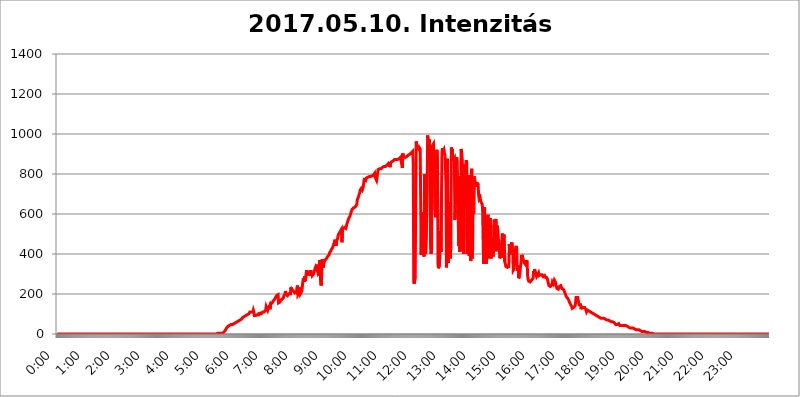
| Category | 2017.05.10. Intenzitás [W/m^2] |
|---|---|
| 0.0 | 0 |
| 0.0006944444444444445 | 0 |
| 0.001388888888888889 | 0 |
| 0.0020833333333333333 | 0 |
| 0.002777777777777778 | 0 |
| 0.003472222222222222 | 0 |
| 0.004166666666666667 | 0 |
| 0.004861111111111111 | 0 |
| 0.005555555555555556 | 0 |
| 0.0062499999999999995 | 0 |
| 0.006944444444444444 | 0 |
| 0.007638888888888889 | 0 |
| 0.008333333333333333 | 0 |
| 0.009027777777777779 | 0 |
| 0.009722222222222222 | 0 |
| 0.010416666666666666 | 0 |
| 0.011111111111111112 | 0 |
| 0.011805555555555555 | 0 |
| 0.012499999999999999 | 0 |
| 0.013194444444444444 | 0 |
| 0.013888888888888888 | 0 |
| 0.014583333333333332 | 0 |
| 0.015277777777777777 | 0 |
| 0.015972222222222224 | 0 |
| 0.016666666666666666 | 0 |
| 0.017361111111111112 | 0 |
| 0.018055555555555557 | 0 |
| 0.01875 | 0 |
| 0.019444444444444445 | 0 |
| 0.02013888888888889 | 0 |
| 0.020833333333333332 | 0 |
| 0.02152777777777778 | 0 |
| 0.022222222222222223 | 0 |
| 0.02291666666666667 | 0 |
| 0.02361111111111111 | 0 |
| 0.024305555555555556 | 0 |
| 0.024999999999999998 | 0 |
| 0.025694444444444447 | 0 |
| 0.02638888888888889 | 0 |
| 0.027083333333333334 | 0 |
| 0.027777777777777776 | 0 |
| 0.02847222222222222 | 0 |
| 0.029166666666666664 | 0 |
| 0.029861111111111113 | 0 |
| 0.030555555555555555 | 0 |
| 0.03125 | 0 |
| 0.03194444444444445 | 0 |
| 0.03263888888888889 | 0 |
| 0.03333333333333333 | 0 |
| 0.034027777777777775 | 0 |
| 0.034722222222222224 | 0 |
| 0.035416666666666666 | 0 |
| 0.036111111111111115 | 0 |
| 0.03680555555555556 | 0 |
| 0.0375 | 0 |
| 0.03819444444444444 | 0 |
| 0.03888888888888889 | 0 |
| 0.03958333333333333 | 0 |
| 0.04027777777777778 | 0 |
| 0.04097222222222222 | 0 |
| 0.041666666666666664 | 0 |
| 0.042361111111111106 | 0 |
| 0.04305555555555556 | 0 |
| 0.043750000000000004 | 0 |
| 0.044444444444444446 | 0 |
| 0.04513888888888889 | 0 |
| 0.04583333333333334 | 0 |
| 0.04652777777777778 | 0 |
| 0.04722222222222222 | 0 |
| 0.04791666666666666 | 0 |
| 0.04861111111111111 | 0 |
| 0.049305555555555554 | 0 |
| 0.049999999999999996 | 0 |
| 0.05069444444444445 | 0 |
| 0.051388888888888894 | 0 |
| 0.052083333333333336 | 0 |
| 0.05277777777777778 | 0 |
| 0.05347222222222222 | 0 |
| 0.05416666666666667 | 0 |
| 0.05486111111111111 | 0 |
| 0.05555555555555555 | 0 |
| 0.05625 | 0 |
| 0.05694444444444444 | 0 |
| 0.057638888888888885 | 0 |
| 0.05833333333333333 | 0 |
| 0.05902777777777778 | 0 |
| 0.059722222222222225 | 0 |
| 0.06041666666666667 | 0 |
| 0.061111111111111116 | 0 |
| 0.06180555555555556 | 0 |
| 0.0625 | 0 |
| 0.06319444444444444 | 0 |
| 0.06388888888888888 | 0 |
| 0.06458333333333334 | 0 |
| 0.06527777777777778 | 0 |
| 0.06597222222222222 | 0 |
| 0.06666666666666667 | 0 |
| 0.06736111111111111 | 0 |
| 0.06805555555555555 | 0 |
| 0.06874999999999999 | 0 |
| 0.06944444444444443 | 0 |
| 0.07013888888888889 | 0 |
| 0.07083333333333333 | 0 |
| 0.07152777777777779 | 0 |
| 0.07222222222222223 | 0 |
| 0.07291666666666667 | 0 |
| 0.07361111111111111 | 0 |
| 0.07430555555555556 | 0 |
| 0.075 | 0 |
| 0.07569444444444444 | 0 |
| 0.0763888888888889 | 0 |
| 0.07708333333333334 | 0 |
| 0.07777777777777778 | 0 |
| 0.07847222222222222 | 0 |
| 0.07916666666666666 | 0 |
| 0.0798611111111111 | 0 |
| 0.08055555555555556 | 0 |
| 0.08125 | 0 |
| 0.08194444444444444 | 0 |
| 0.08263888888888889 | 0 |
| 0.08333333333333333 | 0 |
| 0.08402777777777777 | 0 |
| 0.08472222222222221 | 0 |
| 0.08541666666666665 | 0 |
| 0.08611111111111112 | 0 |
| 0.08680555555555557 | 0 |
| 0.08750000000000001 | 0 |
| 0.08819444444444445 | 0 |
| 0.08888888888888889 | 0 |
| 0.08958333333333333 | 0 |
| 0.09027777777777778 | 0 |
| 0.09097222222222222 | 0 |
| 0.09166666666666667 | 0 |
| 0.09236111111111112 | 0 |
| 0.09305555555555556 | 0 |
| 0.09375 | 0 |
| 0.09444444444444444 | 0 |
| 0.09513888888888888 | 0 |
| 0.09583333333333333 | 0 |
| 0.09652777777777777 | 0 |
| 0.09722222222222222 | 0 |
| 0.09791666666666667 | 0 |
| 0.09861111111111111 | 0 |
| 0.09930555555555555 | 0 |
| 0.09999999999999999 | 0 |
| 0.10069444444444443 | 0 |
| 0.1013888888888889 | 0 |
| 0.10208333333333335 | 0 |
| 0.10277777777777779 | 0 |
| 0.10347222222222223 | 0 |
| 0.10416666666666667 | 0 |
| 0.10486111111111111 | 0 |
| 0.10555555555555556 | 0 |
| 0.10625 | 0 |
| 0.10694444444444444 | 0 |
| 0.1076388888888889 | 0 |
| 0.10833333333333334 | 0 |
| 0.10902777777777778 | 0 |
| 0.10972222222222222 | 0 |
| 0.1111111111111111 | 0 |
| 0.11180555555555556 | 0 |
| 0.11180555555555556 | 0 |
| 0.1125 | 0 |
| 0.11319444444444444 | 0 |
| 0.11388888888888889 | 0 |
| 0.11458333333333333 | 0 |
| 0.11527777777777777 | 0 |
| 0.11597222222222221 | 0 |
| 0.11666666666666665 | 0 |
| 0.1173611111111111 | 0 |
| 0.11805555555555557 | 0 |
| 0.11944444444444445 | 0 |
| 0.12013888888888889 | 0 |
| 0.12083333333333333 | 0 |
| 0.12152777777777778 | 0 |
| 0.12222222222222223 | 0 |
| 0.12291666666666667 | 0 |
| 0.12291666666666667 | 0 |
| 0.12361111111111112 | 0 |
| 0.12430555555555556 | 0 |
| 0.125 | 0 |
| 0.12569444444444444 | 0 |
| 0.12638888888888888 | 0 |
| 0.12708333333333333 | 0 |
| 0.16875 | 0 |
| 0.12847222222222224 | 0 |
| 0.12916666666666668 | 0 |
| 0.12986111111111112 | 0 |
| 0.13055555555555556 | 0 |
| 0.13125 | 0 |
| 0.13194444444444445 | 0 |
| 0.1326388888888889 | 0 |
| 0.13333333333333333 | 0 |
| 0.13402777777777777 | 0 |
| 0.13402777777777777 | 0 |
| 0.13472222222222222 | 0 |
| 0.13541666666666666 | 0 |
| 0.1361111111111111 | 0 |
| 0.13749999999999998 | 0 |
| 0.13819444444444443 | 0 |
| 0.1388888888888889 | 0 |
| 0.13958333333333334 | 0 |
| 0.14027777777777778 | 0 |
| 0.14097222222222222 | 0 |
| 0.14166666666666666 | 0 |
| 0.1423611111111111 | 0 |
| 0.14305555555555557 | 0 |
| 0.14375000000000002 | 0 |
| 0.14444444444444446 | 0 |
| 0.1451388888888889 | 0 |
| 0.1451388888888889 | 0 |
| 0.14652777777777778 | 0 |
| 0.14722222222222223 | 0 |
| 0.14791666666666667 | 0 |
| 0.1486111111111111 | 0 |
| 0.14930555555555555 | 0 |
| 0.15 | 0 |
| 0.15069444444444444 | 0 |
| 0.15138888888888888 | 0 |
| 0.15208333333333332 | 0 |
| 0.15277777777777776 | 0 |
| 0.15347222222222223 | 0 |
| 0.15416666666666667 | 0 |
| 0.15486111111111112 | 0 |
| 0.15555555555555556 | 0 |
| 0.15625 | 0 |
| 0.15694444444444444 | 0 |
| 0.15763888888888888 | 0 |
| 0.15833333333333333 | 0 |
| 0.15902777777777777 | 0 |
| 0.15972222222222224 | 0 |
| 0.16041666666666668 | 0 |
| 0.16111111111111112 | 0 |
| 0.16180555555555556 | 0 |
| 0.1625 | 0 |
| 0.16319444444444445 | 0 |
| 0.1638888888888889 | 0 |
| 0.16458333333333333 | 0 |
| 0.16527777777777777 | 0 |
| 0.16597222222222222 | 0 |
| 0.16666666666666666 | 0 |
| 0.1673611111111111 | 0 |
| 0.16805555555555554 | 0 |
| 0.16874999999999998 | 0 |
| 0.16944444444444443 | 0 |
| 0.17013888888888887 | 0 |
| 0.1708333333333333 | 0 |
| 0.17152777777777775 | 0 |
| 0.17222222222222225 | 0 |
| 0.1729166666666667 | 0 |
| 0.17361111111111113 | 0 |
| 0.17430555555555557 | 0 |
| 0.17500000000000002 | 0 |
| 0.17569444444444446 | 0 |
| 0.1763888888888889 | 0 |
| 0.17708333333333334 | 0 |
| 0.17777777777777778 | 0 |
| 0.17847222222222223 | 0 |
| 0.17916666666666667 | 0 |
| 0.1798611111111111 | 0 |
| 0.18055555555555555 | 0 |
| 0.18125 | 0 |
| 0.18194444444444444 | 0 |
| 0.1826388888888889 | 0 |
| 0.18333333333333335 | 0 |
| 0.1840277777777778 | 0 |
| 0.18472222222222223 | 0 |
| 0.18541666666666667 | 0 |
| 0.18611111111111112 | 0 |
| 0.18680555555555556 | 0 |
| 0.1875 | 0 |
| 0.18819444444444444 | 0 |
| 0.18888888888888888 | 0 |
| 0.18958333333333333 | 0 |
| 0.19027777777777777 | 0 |
| 0.1909722222222222 | 0 |
| 0.19166666666666665 | 0 |
| 0.19236111111111112 | 0 |
| 0.19305555555555554 | 0 |
| 0.19375 | 0 |
| 0.19444444444444445 | 0 |
| 0.1951388888888889 | 0 |
| 0.19583333333333333 | 0 |
| 0.19652777777777777 | 0 |
| 0.19722222222222222 | 0 |
| 0.19791666666666666 | 0 |
| 0.1986111111111111 | 0 |
| 0.19930555555555554 | 0 |
| 0.19999999999999998 | 0 |
| 0.20069444444444443 | 0 |
| 0.20138888888888887 | 0 |
| 0.2020833333333333 | 0 |
| 0.2027777777777778 | 0 |
| 0.2034722222222222 | 0 |
| 0.2041666666666667 | 0 |
| 0.20486111111111113 | 0 |
| 0.20555555555555557 | 0 |
| 0.20625000000000002 | 0 |
| 0.20694444444444446 | 0 |
| 0.2076388888888889 | 0 |
| 0.20833333333333334 | 0 |
| 0.20902777777777778 | 0 |
| 0.20972222222222223 | 0 |
| 0.21041666666666667 | 0 |
| 0.2111111111111111 | 0 |
| 0.21180555555555555 | 0 |
| 0.2125 | 0 |
| 0.21319444444444444 | 0 |
| 0.2138888888888889 | 0 |
| 0.21458333333333335 | 0 |
| 0.2152777777777778 | 0 |
| 0.21597222222222223 | 0 |
| 0.21666666666666667 | 0 |
| 0.21736111111111112 | 0 |
| 0.21805555555555556 | 0 |
| 0.21875 | 0 |
| 0.21944444444444444 | 0 |
| 0.22013888888888888 | 0 |
| 0.22083333333333333 | 0 |
| 0.22152777777777777 | 0 |
| 0.2222222222222222 | 0 |
| 0.22291666666666665 | 0 |
| 0.2236111111111111 | 0 |
| 0.22430555555555556 | 0 |
| 0.225 | 3.525 |
| 0.22569444444444445 | 3.525 |
| 0.2263888888888889 | 3.525 |
| 0.22708333333333333 | 3.525 |
| 0.22777777777777777 | 3.525 |
| 0.22847222222222222 | 3.525 |
| 0.22916666666666666 | 3.525 |
| 0.2298611111111111 | 3.525 |
| 0.23055555555555554 | 3.525 |
| 0.23124999999999998 | 3.525 |
| 0.23194444444444443 | 7.887 |
| 0.23263888888888887 | 7.887 |
| 0.2333333333333333 | 7.887 |
| 0.2340277777777778 | 12.257 |
| 0.2347222222222222 | 12.257 |
| 0.2354166666666667 | 16.636 |
| 0.23611111111111113 | 21.024 |
| 0.23680555555555557 | 21.024 |
| 0.23750000000000002 | 29.823 |
| 0.23819444444444446 | 29.823 |
| 0.2388888888888889 | 34.234 |
| 0.23958333333333334 | 38.653 |
| 0.24027777777777778 | 38.653 |
| 0.24097222222222223 | 38.653 |
| 0.24166666666666667 | 43.079 |
| 0.2423611111111111 | 43.079 |
| 0.24305555555555555 | 47.511 |
| 0.24375 | 47.511 |
| 0.24444444444444446 | 47.511 |
| 0.24513888888888888 | 47.511 |
| 0.24583333333333335 | 47.511 |
| 0.2465277777777778 | 51.951 |
| 0.24722222222222223 | 51.951 |
| 0.24791666666666667 | 51.951 |
| 0.24861111111111112 | 56.398 |
| 0.24930555555555556 | 56.398 |
| 0.25 | 56.398 |
| 0.25069444444444444 | 56.398 |
| 0.2513888888888889 | 60.85 |
| 0.2520833333333333 | 60.85 |
| 0.25277777777777777 | 60.85 |
| 0.2534722222222222 | 65.31 |
| 0.25416666666666665 | 65.31 |
| 0.2548611111111111 | 65.31 |
| 0.2555555555555556 | 65.31 |
| 0.25625000000000003 | 69.775 |
| 0.2569444444444445 | 69.775 |
| 0.2576388888888889 | 74.246 |
| 0.25833333333333336 | 74.246 |
| 0.2590277777777778 | 78.722 |
| 0.25972222222222224 | 78.722 |
| 0.2604166666666667 | 83.205 |
| 0.2611111111111111 | 83.205 |
| 0.26180555555555557 | 87.692 |
| 0.2625 | 87.692 |
| 0.26319444444444445 | 92.184 |
| 0.2638888888888889 | 92.184 |
| 0.26458333333333334 | 92.184 |
| 0.2652777777777778 | 92.184 |
| 0.2659722222222222 | 92.184 |
| 0.26666666666666666 | 96.682 |
| 0.2673611111111111 | 96.682 |
| 0.26805555555555555 | 101.184 |
| 0.26875 | 101.184 |
| 0.26944444444444443 | 105.69 |
| 0.2701388888888889 | 110.201 |
| 0.2708333333333333 | 105.69 |
| 0.27152777777777776 | 110.201 |
| 0.2722222222222222 | 110.201 |
| 0.27291666666666664 | 110.201 |
| 0.2736111111111111 | 110.201 |
| 0.2743055555555555 | 110.201 |
| 0.27499999999999997 | 119.235 |
| 0.27569444444444446 | 110.201 |
| 0.27638888888888885 | 92.184 |
| 0.27708333333333335 | 87.692 |
| 0.2777777777777778 | 92.184 |
| 0.27847222222222223 | 92.184 |
| 0.2791666666666667 | 92.184 |
| 0.2798611111111111 | 96.682 |
| 0.28055555555555556 | 96.682 |
| 0.28125 | 96.682 |
| 0.28194444444444444 | 96.682 |
| 0.2826388888888889 | 96.682 |
| 0.2833333333333333 | 110.201 |
| 0.28402777777777777 | 101.184 |
| 0.2847222222222222 | 96.682 |
| 0.28541666666666665 | 96.682 |
| 0.28611111111111115 | 101.184 |
| 0.28680555555555554 | 101.184 |
| 0.28750000000000003 | 101.184 |
| 0.2881944444444445 | 110.201 |
| 0.2888888888888889 | 105.69 |
| 0.28958333333333336 | 110.201 |
| 0.2902777777777778 | 110.201 |
| 0.29097222222222224 | 114.716 |
| 0.2916666666666667 | 105.69 |
| 0.2923611111111111 | 119.235 |
| 0.29305555555555557 | 137.347 |
| 0.29375 | 137.347 |
| 0.29444444444444445 | 141.884 |
| 0.2951388888888889 | 119.235 |
| 0.29583333333333334 | 128.284 |
| 0.2965277777777778 | 132.814 |
| 0.2972222222222222 | 128.284 |
| 0.29791666666666666 | 141.884 |
| 0.2986111111111111 | 123.758 |
| 0.29930555555555555 | 155.509 |
| 0.3 | 155.509 |
| 0.30069444444444443 | 155.509 |
| 0.3013888888888889 | 155.509 |
| 0.3020833333333333 | 160.056 |
| 0.30277777777777776 | 164.605 |
| 0.3034722222222222 | 164.605 |
| 0.30416666666666664 | 169.156 |
| 0.3048611111111111 | 173.709 |
| 0.3055555555555555 | 178.264 |
| 0.30624999999999997 | 182.82 |
| 0.3069444444444444 | 187.378 |
| 0.3076388888888889 | 191.937 |
| 0.30833333333333335 | 196.497 |
| 0.3090277777777778 | 196.497 |
| 0.30972222222222223 | 196.497 |
| 0.3104166666666667 | 155.509 |
| 0.3111111111111111 | 155.509 |
| 0.31180555555555556 | 155.509 |
| 0.3125 | 160.056 |
| 0.31319444444444444 | 169.156 |
| 0.3138888888888889 | 164.605 |
| 0.3145833333333333 | 169.156 |
| 0.31527777777777777 | 173.709 |
| 0.3159722222222222 | 173.709 |
| 0.31666666666666665 | 178.264 |
| 0.31736111111111115 | 182.82 |
| 0.31805555555555554 | 191.937 |
| 0.31875000000000003 | 187.378 |
| 0.3194444444444445 | 201.058 |
| 0.3201388888888889 | 214.746 |
| 0.32083333333333336 | 201.058 |
| 0.3215277777777778 | 196.497 |
| 0.32222222222222224 | 196.497 |
| 0.3229166666666667 | 191.937 |
| 0.3236111111111111 | 191.937 |
| 0.32430555555555557 | 191.937 |
| 0.325 | 201.058 |
| 0.32569444444444445 | 196.497 |
| 0.3263888888888889 | 196.497 |
| 0.32708333333333334 | 201.058 |
| 0.3277777777777778 | 233 |
| 0.3284722222222222 | 210.182 |
| 0.32916666666666666 | 223.873 |
| 0.3298611111111111 | 223.873 |
| 0.33055555555555555 | 219.309 |
| 0.33125 | 214.746 |
| 0.33194444444444443 | 210.182 |
| 0.3326388888888889 | 214.746 |
| 0.3333333333333333 | 205.62 |
| 0.3340277777777778 | 210.182 |
| 0.3347222222222222 | 201.058 |
| 0.3354166666666667 | 210.182 |
| 0.3361111111111111 | 228.436 |
| 0.3368055555555556 | 242.127 |
| 0.33749999999999997 | 196.497 |
| 0.33819444444444446 | 201.058 |
| 0.33888888888888885 | 205.62 |
| 0.33958333333333335 | 205.62 |
| 0.34027777777777773 | 233 |
| 0.34097222222222223 | 201.058 |
| 0.3416666666666666 | 205.62 |
| 0.3423611111111111 | 201.058 |
| 0.3430555555555555 | 214.746 |
| 0.34375 | 237.564 |
| 0.3444444444444445 | 260.373 |
| 0.3451388888888889 | 278.603 |
| 0.3458333333333334 | 269.49 |
| 0.34652777777777777 | 260.373 |
| 0.34722222222222227 | 287.709 |
| 0.34791666666666665 | 264.932 |
| 0.34861111111111115 | 287.709 |
| 0.34930555555555554 | 305.898 |
| 0.35000000000000003 | 319.517 |
| 0.3506944444444444 | 301.354 |
| 0.3513888888888889 | 292.259 |
| 0.3520833333333333 | 296.808 |
| 0.3527777777777778 | 314.98 |
| 0.3534722222222222 | 292.259 |
| 0.3541666666666667 | 296.808 |
| 0.3548611111111111 | 305.898 |
| 0.35555555555555557 | 319.517 |
| 0.35625 | 296.808 |
| 0.35694444444444445 | 305.898 |
| 0.3576388888888889 | 292.259 |
| 0.35833333333333334 | 292.259 |
| 0.3590277777777778 | 292.259 |
| 0.3597222222222222 | 301.354 |
| 0.36041666666666666 | 314.98 |
| 0.3611111111111111 | 319.517 |
| 0.36180555555555555 | 328.584 |
| 0.3625 | 314.98 |
| 0.36319444444444443 | 310.44 |
| 0.3638888888888889 | 346.682 |
| 0.3645833333333333 | 319.517 |
| 0.3652777777777778 | 310.44 |
| 0.3659722222222222 | 314.98 |
| 0.3666666666666667 | 328.584 |
| 0.3673611111111111 | 292.259 |
| 0.3680555555555556 | 369.23 |
| 0.36874999999999997 | 346.682 |
| 0.36944444444444446 | 260.373 |
| 0.37013888888888885 | 242.127 |
| 0.37083333333333335 | 296.808 |
| 0.37152777777777773 | 373.729 |
| 0.37222222222222223 | 373.729 |
| 0.3729166666666666 | 333.113 |
| 0.3736111111111111 | 342.162 |
| 0.3743055555555555 | 360.221 |
| 0.375 | 360.221 |
| 0.3756944444444445 | 369.23 |
| 0.3763888888888889 | 369.23 |
| 0.3770833333333334 | 373.729 |
| 0.37777777777777777 | 378.224 |
| 0.37847222222222227 | 378.224 |
| 0.37916666666666665 | 387.202 |
| 0.37986111111111115 | 387.202 |
| 0.38055555555555554 | 391.685 |
| 0.38125000000000003 | 396.164 |
| 0.3819444444444444 | 405.108 |
| 0.3826388888888889 | 405.108 |
| 0.3833333333333333 | 414.035 |
| 0.3840277777777778 | 418.492 |
| 0.3847222222222222 | 422.943 |
| 0.3854166666666667 | 427.39 |
| 0.3861111111111111 | 431.833 |
| 0.38680555555555557 | 436.27 |
| 0.3875 | 445.129 |
| 0.38819444444444445 | 449.551 |
| 0.3888888888888889 | 462.786 |
| 0.38958333333333334 | 471.582 |
| 0.3902777777777778 | 467.187 |
| 0.3909722222222222 | 440.702 |
| 0.39166666666666666 | 462.786 |
| 0.3923611111111111 | 467.187 |
| 0.39305555555555555 | 475.972 |
| 0.39375 | 489.108 |
| 0.39444444444444443 | 497.836 |
| 0.3951388888888889 | 502.192 |
| 0.3958333333333333 | 506.542 |
| 0.3965277777777778 | 510.885 |
| 0.3972222222222222 | 515.223 |
| 0.3979166666666667 | 519.555 |
| 0.3986111111111111 | 523.88 |
| 0.3993055555555556 | 458.38 |
| 0.39999999999999997 | 515.223 |
| 0.40069444444444446 | 523.88 |
| 0.40138888888888885 | 523.88 |
| 0.40208333333333335 | 528.2 |
| 0.40277777777777773 | 532.513 |
| 0.40347222222222223 | 528.2 |
| 0.4041666666666666 | 532.513 |
| 0.4048611111111111 | 528.2 |
| 0.4055555555555555 | 541.121 |
| 0.40625 | 549.704 |
| 0.4069444444444445 | 558.261 |
| 0.4076388888888889 | 566.793 |
| 0.4083333333333334 | 571.049 |
| 0.40902777777777777 | 579.542 |
| 0.40972222222222227 | 583.779 |
| 0.41041666666666665 | 588.009 |
| 0.41111111111111115 | 596.45 |
| 0.41180555555555554 | 604.864 |
| 0.41250000000000003 | 613.252 |
| 0.4131944444444444 | 621.613 |
| 0.4138888888888889 | 625.784 |
| 0.4145833333333333 | 625.784 |
| 0.4152777777777778 | 629.948 |
| 0.4159722222222222 | 629.948 |
| 0.4166666666666667 | 625.784 |
| 0.4173611111111111 | 634.105 |
| 0.41805555555555557 | 634.105 |
| 0.41875 | 638.256 |
| 0.41944444444444445 | 642.4 |
| 0.4201388888888889 | 650.667 |
| 0.42083333333333334 | 671.22 |
| 0.4215277777777778 | 675.311 |
| 0.4222222222222222 | 683.473 |
| 0.42291666666666666 | 691.608 |
| 0.4236111111111111 | 699.717 |
| 0.42430555555555555 | 707.8 |
| 0.425 | 719.877 |
| 0.42569444444444443 | 719.877 |
| 0.4263888888888889 | 727.896 |
| 0.4270833333333333 | 727.896 |
| 0.4277777777777778 | 719.877 |
| 0.4284722222222222 | 727.896 |
| 0.4291666666666667 | 735.89 |
| 0.4298611111111111 | 755.766 |
| 0.4305555555555556 | 771.559 |
| 0.43124999999999997 | 771.559 |
| 0.43194444444444446 | 771.559 |
| 0.43263888888888885 | 767.62 |
| 0.43333333333333335 | 779.42 |
| 0.43402777777777773 | 779.42 |
| 0.43472222222222223 | 783.342 |
| 0.4354166666666666 | 783.342 |
| 0.4361111111111111 | 783.342 |
| 0.4368055555555555 | 783.342 |
| 0.4375 | 787.258 |
| 0.4381944444444445 | 783.342 |
| 0.4388888888888889 | 787.258 |
| 0.4395833333333334 | 787.258 |
| 0.44027777777777777 | 787.258 |
| 0.44097222222222227 | 787.258 |
| 0.44166666666666665 | 791.169 |
| 0.44236111111111115 | 791.169 |
| 0.44305555555555554 | 791.169 |
| 0.44375000000000003 | 795.074 |
| 0.4444444444444444 | 798.974 |
| 0.4451388888888889 | 802.868 |
| 0.4458333333333333 | 783.342 |
| 0.4465277777777778 | 783.342 |
| 0.4472222222222222 | 779.42 |
| 0.4479166666666667 | 767.62 |
| 0.4486111111111111 | 783.342 |
| 0.44930555555555557 | 787.258 |
| 0.45 | 822.26 |
| 0.45069444444444445 | 826.123 |
| 0.4513888888888889 | 826.123 |
| 0.45208333333333334 | 826.123 |
| 0.4527777777777778 | 826.123 |
| 0.4534722222222222 | 826.123 |
| 0.45416666666666666 | 826.123 |
| 0.4548611111111111 | 826.123 |
| 0.45555555555555555 | 829.981 |
| 0.45625 | 833.834 |
| 0.45694444444444443 | 833.834 |
| 0.4576388888888889 | 837.682 |
| 0.4583333333333333 | 837.682 |
| 0.4590277777777778 | 841.526 |
| 0.4597222222222222 | 841.526 |
| 0.4604166666666667 | 837.682 |
| 0.4611111111111111 | 841.526 |
| 0.4618055555555556 | 841.526 |
| 0.46249999999999997 | 845.365 |
| 0.46319444444444446 | 849.199 |
| 0.46388888888888885 | 849.199 |
| 0.46458333333333335 | 853.029 |
| 0.46527777777777773 | 853.029 |
| 0.46597222222222223 | 845.365 |
| 0.4666666666666666 | 833.834 |
| 0.4673611111111111 | 853.029 |
| 0.4680555555555555 | 849.199 |
| 0.46875 | 860.676 |
| 0.4694444444444445 | 864.493 |
| 0.4701388888888889 | 860.676 |
| 0.4708333333333334 | 864.493 |
| 0.47152777777777777 | 868.305 |
| 0.47222222222222227 | 868.305 |
| 0.47291666666666665 | 872.114 |
| 0.47361111111111115 | 875.918 |
| 0.47430555555555554 | 875.918 |
| 0.47500000000000003 | 872.114 |
| 0.4756944444444444 | 868.305 |
| 0.4763888888888889 | 868.305 |
| 0.4770833333333333 | 872.114 |
| 0.4777777777777778 | 868.305 |
| 0.4784722222222222 | 872.114 |
| 0.4791666666666667 | 875.918 |
| 0.4798611111111111 | 875.918 |
| 0.48055555555555557 | 879.719 |
| 0.48125 | 883.516 |
| 0.48194444444444445 | 887.309 |
| 0.4826388888888889 | 887.309 |
| 0.48333333333333334 | 845.365 |
| 0.4840277777777778 | 829.981 |
| 0.4847222222222222 | 902.447 |
| 0.48541666666666666 | 879.719 |
| 0.4861111111111111 | 887.309 |
| 0.48680555555555555 | 887.309 |
| 0.4875 | 883.516 |
| 0.48819444444444443 | 883.516 |
| 0.4888888888888889 | 883.516 |
| 0.4895833333333333 | 887.309 |
| 0.4902777777777778 | 887.309 |
| 0.4909722222222222 | 887.309 |
| 0.4916666666666667 | 891.099 |
| 0.4923611111111111 | 894.885 |
| 0.4930555555555556 | 894.885 |
| 0.49374999999999997 | 898.668 |
| 0.49444444444444446 | 898.668 |
| 0.49513888888888885 | 898.668 |
| 0.49583333333333335 | 902.447 |
| 0.49652777777777773 | 906.223 |
| 0.49722222222222223 | 909.996 |
| 0.4979166666666666 | 909.996 |
| 0.4986111111111111 | 913.766 |
| 0.4993055555555555 | 853.029 |
| 0.5 | 260.373 |
| 0.5006944444444444 | 251.251 |
| 0.5013888888888889 | 255.813 |
| 0.5020833333333333 | 287.709 |
| 0.5027777777777778 | 687.544 |
| 0.5034722222222222 | 962.555 |
| 0.5041666666666667 | 943.832 |
| 0.5048611111111111 | 940.082 |
| 0.5055555555555555 | 932.576 |
| 0.50625 | 928.819 |
| 0.5069444444444444 | 925.06 |
| 0.5076388888888889 | 932.576 |
| 0.5083333333333333 | 932.576 |
| 0.5090277777777777 | 925.06 |
| 0.5097222222222222 | 671.22 |
| 0.5104166666666666 | 396.164 |
| 0.5111111111111112 | 609.062 |
| 0.5118055555555555 | 418.492 |
| 0.5125000000000001 | 480.356 |
| 0.5131944444444444 | 562.53 |
| 0.513888888888889 | 396.164 |
| 0.5145833333333333 | 387.202 |
| 0.5152777777777778 | 798.974 |
| 0.5159722222222222 | 414.035 |
| 0.5166666666666667 | 400.638 |
| 0.517361111111111 | 400.638 |
| 0.5180555555555556 | 566.793 |
| 0.5187499999999999 | 687.544 |
| 0.5194444444444445 | 992.448 |
| 0.5201388888888888 | 966.295 |
| 0.5208333333333334 | 928.819 |
| 0.5215277777777778 | 973.772 |
| 0.5222222222222223 | 970.034 |
| 0.5229166666666667 | 837.682 |
| 0.5236111111111111 | 431.833 |
| 0.5243055555555556 | 400.638 |
| 0.525 | 431.833 |
| 0.5256944444444445 | 883.516 |
| 0.5263888888888889 | 943.832 |
| 0.5270833333333333 | 947.58 |
| 0.5277777777777778 | 951.327 |
| 0.5284722222222222 | 747.834 |
| 0.5291666666666667 | 868.305 |
| 0.5298611111111111 | 621.613 |
| 0.5305555555555556 | 583.779 |
| 0.53125 | 731.896 |
| 0.5319444444444444 | 906.223 |
| 0.5326388888888889 | 921.298 |
| 0.5333333333333333 | 853.029 |
| 0.5340277777777778 | 351.198 |
| 0.5347222222222222 | 328.584 |
| 0.5354166666666667 | 324.052 |
| 0.5361111111111111 | 346.682 |
| 0.5368055555555555 | 449.551 |
| 0.5375 | 515.223 |
| 0.5381944444444444 | 409.574 |
| 0.5388888888888889 | 683.473 |
| 0.5395833333333333 | 906.223 |
| 0.5402777777777777 | 928.819 |
| 0.5409722222222222 | 909.996 |
| 0.5416666666666666 | 909.996 |
| 0.5423611111111112 | 921.298 |
| 0.5430555555555555 | 906.223 |
| 0.5437500000000001 | 894.885 |
| 0.5444444444444444 | 841.526 |
| 0.545138888888889 | 747.834 |
| 0.5458333333333333 | 333.113 |
| 0.5465277777777778 | 405.108 |
| 0.5472222222222222 | 875.918 |
| 0.5479166666666667 | 515.223 |
| 0.548611111111111 | 355.712 |
| 0.5493055555555556 | 562.53 |
| 0.5499999999999999 | 658.909 |
| 0.5506944444444445 | 480.356 |
| 0.5513888888888888 | 378.224 |
| 0.5520833333333334 | 462.786 |
| 0.5527777777777778 | 932.576 |
| 0.5534722222222223 | 917.534 |
| 0.5541666666666667 | 925.06 |
| 0.5548611111111111 | 864.493 |
| 0.5555555555555556 | 872.114 |
| 0.55625 | 868.305 |
| 0.5569444444444445 | 879.719 |
| 0.5576388888888889 | 571.049 |
| 0.5583333333333333 | 617.436 |
| 0.5590277777777778 | 617.436 |
| 0.5597222222222222 | 875.918 |
| 0.5604166666666667 | 883.516 |
| 0.5611111111111111 | 779.42 |
| 0.5618055555555556 | 783.342 |
| 0.5625 | 775.492 |
| 0.5631944444444444 | 440.702 |
| 0.5638888888888889 | 787.258 |
| 0.5645833333333333 | 409.574 |
| 0.5652777777777778 | 549.704 |
| 0.5659722222222222 | 418.492 |
| 0.5666666666666667 | 925.06 |
| 0.5673611111111111 | 894.885 |
| 0.5680555555555555 | 872.114 |
| 0.56875 | 562.53 |
| 0.5694444444444444 | 418.492 |
| 0.5701388888888889 | 400.638 |
| 0.5708333333333333 | 583.779 |
| 0.5715277777777777 | 849.199 |
| 0.5722222222222222 | 814.519 |
| 0.5729166666666666 | 634.105 |
| 0.5736111111111112 | 868.305 |
| 0.5743055555555555 | 860.676 |
| 0.5750000000000001 | 400.638 |
| 0.5756944444444444 | 400.638 |
| 0.576388888888889 | 571.049 |
| 0.5770833333333333 | 795.074 |
| 0.5777777777777778 | 391.685 |
| 0.5784722222222222 | 422.943 |
| 0.5791666666666667 | 795.074 |
| 0.579861111111111 | 364.728 |
| 0.5805555555555556 | 414.035 |
| 0.5812499999999999 | 826.123 |
| 0.5819444444444445 | 378.224 |
| 0.5826388888888888 | 427.39 |
| 0.5833333333333334 | 763.674 |
| 0.5840277777777778 | 600.661 |
| 0.5847222222222223 | 787.258 |
| 0.5854166666666667 | 779.42 |
| 0.5861111111111111 | 759.723 |
| 0.5868055555555556 | 759.723 |
| 0.5875 | 735.89 |
| 0.5881944444444445 | 759.723 |
| 0.5888888888888889 | 747.834 |
| 0.5895833333333333 | 755.766 |
| 0.5902777777777778 | 743.859 |
| 0.5909722222222222 | 695.666 |
| 0.5916666666666667 | 675.311 |
| 0.5923611111111111 | 675.311 |
| 0.5930555555555556 | 683.473 |
| 0.59375 | 667.123 |
| 0.5944444444444444 | 658.909 |
| 0.5951388888888889 | 654.791 |
| 0.5958333333333333 | 650.667 |
| 0.5965277777777778 | 629.948 |
| 0.5972222222222222 | 625.784 |
| 0.5979166666666667 | 351.198 |
| 0.5986111111111111 | 369.23 |
| 0.5993055555555555 | 634.105 |
| 0.6 | 351.198 |
| 0.6006944444444444 | 373.729 |
| 0.6013888888888889 | 351.198 |
| 0.6020833333333333 | 355.712 |
| 0.6027777777777777 | 387.202 |
| 0.6034722222222222 | 583.779 |
| 0.6041666666666666 | 596.45 |
| 0.6048611111111112 | 475.972 |
| 0.6055555555555555 | 391.685 |
| 0.6062500000000001 | 396.164 |
| 0.6069444444444444 | 378.224 |
| 0.607638888888889 | 579.542 |
| 0.6083333333333333 | 378.224 |
| 0.6090277777777778 | 373.729 |
| 0.6097222222222222 | 471.582 |
| 0.6104166666666667 | 471.582 |
| 0.611111111111111 | 387.202 |
| 0.6118055555555556 | 440.702 |
| 0.6124999999999999 | 566.793 |
| 0.6131944444444445 | 566.793 |
| 0.6138888888888888 | 562.53 |
| 0.6145833333333334 | 566.793 |
| 0.6152777777777778 | 575.299 |
| 0.6159722222222223 | 414.035 |
| 0.6166666666666667 | 541.121 |
| 0.6173611111111111 | 532.513 |
| 0.6180555555555556 | 515.223 |
| 0.61875 | 471.582 |
| 0.6194444444444445 | 422.943 |
| 0.6201388888888889 | 414.035 |
| 0.6208333333333333 | 378.224 |
| 0.6215277777777778 | 378.224 |
| 0.6222222222222222 | 405.108 |
| 0.6229166666666667 | 436.27 |
| 0.6236111111111111 | 471.582 |
| 0.6243055555555556 | 502.192 |
| 0.625 | 506.542 |
| 0.6256944444444444 | 382.715 |
| 0.6263888888888889 | 497.836 |
| 0.6270833333333333 | 502.192 |
| 0.6277777777777778 | 360.221 |
| 0.6284722222222222 | 351.198 |
| 0.6291666666666667 | 337.639 |
| 0.6298611111111111 | 333.113 |
| 0.6305555555555555 | 333.113 |
| 0.63125 | 333.113 |
| 0.6319444444444444 | 328.584 |
| 0.6326388888888889 | 328.584 |
| 0.6333333333333333 | 337.639 |
| 0.6340277777777777 | 449.551 |
| 0.6347222222222222 | 396.164 |
| 0.6354166666666666 | 427.39 |
| 0.6361111111111112 | 431.833 |
| 0.6368055555555555 | 449.551 |
| 0.6375000000000001 | 458.38 |
| 0.6381944444444444 | 436.27 |
| 0.638888888888889 | 418.492 |
| 0.6395833333333333 | 319.517 |
| 0.6402777777777778 | 314.98 |
| 0.6409722222222222 | 328.584 |
| 0.6416666666666667 | 396.164 |
| 0.642361111111111 | 391.685 |
| 0.6430555555555556 | 431.833 |
| 0.6437499999999999 | 440.702 |
| 0.6444444444444445 | 422.943 |
| 0.6451388888888888 | 314.98 |
| 0.6458333333333334 | 310.44 |
| 0.6465277777777778 | 342.162 |
| 0.6472222222222223 | 278.603 |
| 0.6479166666666667 | 287.709 |
| 0.6486111111111111 | 301.354 |
| 0.6493055555555556 | 301.354 |
| 0.65 | 305.898 |
| 0.6506944444444445 | 364.728 |
| 0.6513888888888889 | 396.164 |
| 0.6520833333333333 | 396.164 |
| 0.6527777777777778 | 382.715 |
| 0.6534722222222222 | 382.715 |
| 0.6541666666666667 | 387.202 |
| 0.6548611111111111 | 355.712 |
| 0.6555555555555556 | 360.221 |
| 0.65625 | 355.712 |
| 0.6569444444444444 | 346.682 |
| 0.6576388888888889 | 355.712 |
| 0.6583333333333333 | 369.23 |
| 0.6590277777777778 | 360.221 |
| 0.6597222222222222 | 292.259 |
| 0.6604166666666667 | 274.047 |
| 0.6611111111111111 | 264.932 |
| 0.6618055555555555 | 260.373 |
| 0.6625 | 260.373 |
| 0.6631944444444444 | 260.373 |
| 0.6638888888888889 | 260.373 |
| 0.6645833333333333 | 264.932 |
| 0.6652777777777777 | 269.49 |
| 0.6659722222222222 | 269.49 |
| 0.6666666666666666 | 274.047 |
| 0.6673611111111111 | 278.603 |
| 0.6680555555555556 | 314.98 |
| 0.6687500000000001 | 296.808 |
| 0.6694444444444444 | 324.052 |
| 0.6701388888888888 | 314.98 |
| 0.6708333333333334 | 305.898 |
| 0.6715277777777778 | 305.898 |
| 0.6722222222222222 | 287.709 |
| 0.6729166666666666 | 292.259 |
| 0.6736111111111112 | 296.808 |
| 0.6743055555555556 | 296.808 |
| 0.6749999999999999 | 305.898 |
| 0.6756944444444444 | 292.259 |
| 0.6763888888888889 | 292.259 |
| 0.6770833333333334 | 296.808 |
| 0.6777777777777777 | 296.808 |
| 0.6784722222222223 | 301.354 |
| 0.6791666666666667 | 292.259 |
| 0.6798611111111111 | 296.808 |
| 0.6805555555555555 | 296.808 |
| 0.68125 | 287.709 |
| 0.6819444444444445 | 292.259 |
| 0.6826388888888889 | 292.259 |
| 0.6833333333333332 | 292.259 |
| 0.6840277777777778 | 283.156 |
| 0.6847222222222222 | 283.156 |
| 0.6854166666666667 | 278.603 |
| 0.686111111111111 | 283.156 |
| 0.6868055555555556 | 278.603 |
| 0.6875 | 274.047 |
| 0.6881944444444444 | 269.49 |
| 0.688888888888889 | 251.251 |
| 0.6895833333333333 | 242.127 |
| 0.6902777777777778 | 237.564 |
| 0.6909722222222222 | 237.564 |
| 0.6916666666666668 | 237.564 |
| 0.6923611111111111 | 242.127 |
| 0.6930555555555555 | 237.564 |
| 0.69375 | 246.689 |
| 0.6944444444444445 | 260.373 |
| 0.6951388888888889 | 255.813 |
| 0.6958333333333333 | 251.251 |
| 0.6965277777777777 | 260.373 |
| 0.6972222222222223 | 269.49 |
| 0.6979166666666666 | 264.932 |
| 0.6986111111111111 | 260.373 |
| 0.6993055555555556 | 246.689 |
| 0.7000000000000001 | 242.127 |
| 0.7006944444444444 | 228.436 |
| 0.7013888888888888 | 223.873 |
| 0.7020833333333334 | 223.873 |
| 0.7027777777777778 | 223.873 |
| 0.7034722222222222 | 228.436 |
| 0.7041666666666666 | 237.564 |
| 0.7048611111111112 | 237.564 |
| 0.7055555555555556 | 242.127 |
| 0.7062499999999999 | 242.127 |
| 0.7069444444444444 | 237.564 |
| 0.7076388888888889 | 228.436 |
| 0.7083333333333334 | 223.873 |
| 0.7090277777777777 | 223.873 |
| 0.7097222222222223 | 223.873 |
| 0.7104166666666667 | 219.309 |
| 0.7111111111111111 | 214.746 |
| 0.7118055555555555 | 210.182 |
| 0.7125 | 201.058 |
| 0.7131944444444445 | 196.497 |
| 0.7138888888888889 | 187.378 |
| 0.7145833333333332 | 182.82 |
| 0.7152777777777778 | 182.82 |
| 0.7159722222222222 | 178.264 |
| 0.7166666666666667 | 173.709 |
| 0.717361111111111 | 169.156 |
| 0.7180555555555556 | 164.605 |
| 0.71875 | 155.509 |
| 0.7194444444444444 | 150.964 |
| 0.720138888888889 | 146.423 |
| 0.7208333333333333 | 150.964 |
| 0.7215277777777778 | 137.347 |
| 0.7222222222222222 | 128.284 |
| 0.7229166666666668 | 132.814 |
| 0.7236111111111111 | 128.284 |
| 0.7243055555555555 | 132.814 |
| 0.725 | 132.814 |
| 0.7256944444444445 | 137.347 |
| 0.7263888888888889 | 141.884 |
| 0.7270833333333333 | 146.423 |
| 0.7277777777777777 | 182.82 |
| 0.7284722222222223 | 182.82 |
| 0.7291666666666666 | 182.82 |
| 0.7298611111111111 | 182.82 |
| 0.7305555555555556 | 169.156 |
| 0.7312500000000001 | 164.605 |
| 0.7319444444444444 | 146.423 |
| 0.7326388888888888 | 146.423 |
| 0.7333333333333334 | 141.884 |
| 0.7340277777777778 | 146.423 |
| 0.7347222222222222 | 123.758 |
| 0.7354166666666666 | 132.814 |
| 0.7361111111111112 | 137.347 |
| 0.7368055555555556 | 137.347 |
| 0.7374999999999999 | 132.814 |
| 0.7381944444444444 | 132.814 |
| 0.7388888888888889 | 128.284 |
| 0.7395833333333334 | 132.814 |
| 0.7402777777777777 | 128.284 |
| 0.7409722222222223 | 128.284 |
| 0.7416666666666667 | 119.235 |
| 0.7423611111111111 | 110.201 |
| 0.7430555555555555 | 110.201 |
| 0.74375 | 119.235 |
| 0.7444444444444445 | 119.235 |
| 0.7451388888888889 | 114.716 |
| 0.7458333333333332 | 114.716 |
| 0.7465277777777778 | 110.201 |
| 0.7472222222222222 | 110.201 |
| 0.7479166666666667 | 110.201 |
| 0.748611111111111 | 110.201 |
| 0.7493055555555556 | 105.69 |
| 0.75 | 105.69 |
| 0.7506944444444444 | 101.184 |
| 0.751388888888889 | 101.184 |
| 0.7520833333333333 | 101.184 |
| 0.7527777777777778 | 101.184 |
| 0.7534722222222222 | 101.184 |
| 0.7541666666666668 | 96.682 |
| 0.7548611111111111 | 96.682 |
| 0.7555555555555555 | 96.682 |
| 0.75625 | 92.184 |
| 0.7569444444444445 | 92.184 |
| 0.7576388888888889 | 92.184 |
| 0.7583333333333333 | 87.692 |
| 0.7590277777777777 | 87.692 |
| 0.7597222222222223 | 83.205 |
| 0.7604166666666666 | 83.205 |
| 0.7611111111111111 | 78.722 |
| 0.7618055555555556 | 78.722 |
| 0.7625000000000001 | 78.722 |
| 0.7631944444444444 | 78.722 |
| 0.7638888888888888 | 78.722 |
| 0.7645833333333334 | 78.722 |
| 0.7652777777777778 | 78.722 |
| 0.7659722222222222 | 78.722 |
| 0.7666666666666666 | 78.722 |
| 0.7673611111111112 | 74.246 |
| 0.7680555555555556 | 74.246 |
| 0.7687499999999999 | 74.246 |
| 0.7694444444444444 | 74.246 |
| 0.7701388888888889 | 74.246 |
| 0.7708333333333334 | 69.775 |
| 0.7715277777777777 | 69.775 |
| 0.7722222222222223 | 69.775 |
| 0.7729166666666667 | 69.775 |
| 0.7736111111111111 | 65.31 |
| 0.7743055555555555 | 65.31 |
| 0.775 | 65.31 |
| 0.7756944444444445 | 60.85 |
| 0.7763888888888889 | 60.85 |
| 0.7770833333333332 | 60.85 |
| 0.7777777777777778 | 60.85 |
| 0.7784722222222222 | 60.85 |
| 0.7791666666666667 | 60.85 |
| 0.779861111111111 | 60.85 |
| 0.7805555555555556 | 56.398 |
| 0.78125 | 56.398 |
| 0.7819444444444444 | 51.951 |
| 0.782638888888889 | 51.951 |
| 0.7833333333333333 | 47.511 |
| 0.7840277777777778 | 43.079 |
| 0.7847222222222222 | 43.079 |
| 0.7854166666666668 | 47.511 |
| 0.7861111111111111 | 47.511 |
| 0.7868055555555555 | 51.951 |
| 0.7875 | 51.951 |
| 0.7881944444444445 | 47.511 |
| 0.7888888888888889 | 43.079 |
| 0.7895833333333333 | 43.079 |
| 0.7902777777777777 | 38.653 |
| 0.7909722222222223 | 43.079 |
| 0.7916666666666666 | 47.511 |
| 0.7923611111111111 | 43.079 |
| 0.7930555555555556 | 43.079 |
| 0.7937500000000001 | 43.079 |
| 0.7944444444444444 | 43.079 |
| 0.7951388888888888 | 43.079 |
| 0.7958333333333334 | 43.079 |
| 0.7965277777777778 | 43.079 |
| 0.7972222222222222 | 43.079 |
| 0.7979166666666666 | 38.653 |
| 0.7986111111111112 | 38.653 |
| 0.7993055555555556 | 38.653 |
| 0.7999999999999999 | 38.653 |
| 0.8006944444444444 | 34.234 |
| 0.8013888888888889 | 34.234 |
| 0.8020833333333334 | 34.234 |
| 0.8027777777777777 | 29.823 |
| 0.8034722222222223 | 29.823 |
| 0.8041666666666667 | 29.823 |
| 0.8048611111111111 | 29.823 |
| 0.8055555555555555 | 29.823 |
| 0.80625 | 29.823 |
| 0.8069444444444445 | 29.823 |
| 0.8076388888888889 | 29.823 |
| 0.8083333333333332 | 25.419 |
| 0.8090277777777778 | 25.419 |
| 0.8097222222222222 | 25.419 |
| 0.8104166666666667 | 25.419 |
| 0.811111111111111 | 25.419 |
| 0.8118055555555556 | 21.024 |
| 0.8125 | 21.024 |
| 0.8131944444444444 | 21.024 |
| 0.813888888888889 | 21.024 |
| 0.8145833333333333 | 21.024 |
| 0.8152777777777778 | 21.024 |
| 0.8159722222222222 | 21.024 |
| 0.8166666666666668 | 21.024 |
| 0.8173611111111111 | 21.024 |
| 0.8180555555555555 | 16.636 |
| 0.81875 | 16.636 |
| 0.8194444444444445 | 16.636 |
| 0.8201388888888889 | 12.257 |
| 0.8208333333333333 | 12.257 |
| 0.8215277777777777 | 12.257 |
| 0.8222222222222223 | 12.257 |
| 0.8229166666666666 | 12.257 |
| 0.8236111111111111 | 12.257 |
| 0.8243055555555556 | 12.257 |
| 0.8250000000000001 | 12.257 |
| 0.8256944444444444 | 7.887 |
| 0.8263888888888888 | 7.887 |
| 0.8270833333333334 | 7.887 |
| 0.8277777777777778 | 7.887 |
| 0.8284722222222222 | 7.887 |
| 0.8291666666666666 | 3.525 |
| 0.8298611111111112 | 3.525 |
| 0.8305555555555556 | 3.525 |
| 0.8312499999999999 | 3.525 |
| 0.8319444444444444 | 3.525 |
| 0.8326388888888889 | 3.525 |
| 0.8333333333333334 | 3.525 |
| 0.8340277777777777 | 3.525 |
| 0.8347222222222223 | 3.525 |
| 0.8354166666666667 | 3.525 |
| 0.8361111111111111 | 3.525 |
| 0.8368055555555555 | 0 |
| 0.8375 | 0 |
| 0.8381944444444445 | 0 |
| 0.8388888888888889 | 0 |
| 0.8395833333333332 | 0 |
| 0.8402777777777778 | 0 |
| 0.8409722222222222 | 0 |
| 0.8416666666666667 | 0 |
| 0.842361111111111 | 0 |
| 0.8430555555555556 | 0 |
| 0.84375 | 0 |
| 0.8444444444444444 | 0 |
| 0.845138888888889 | 0 |
| 0.8458333333333333 | 0 |
| 0.8465277777777778 | 0 |
| 0.8472222222222222 | 0 |
| 0.8479166666666668 | 0 |
| 0.8486111111111111 | 0 |
| 0.8493055555555555 | 0 |
| 0.85 | 0 |
| 0.8506944444444445 | 0 |
| 0.8513888888888889 | 0 |
| 0.8520833333333333 | 0 |
| 0.8527777777777777 | 0 |
| 0.8534722222222223 | 0 |
| 0.8541666666666666 | 0 |
| 0.8548611111111111 | 0 |
| 0.8555555555555556 | 0 |
| 0.8562500000000001 | 0 |
| 0.8569444444444444 | 0 |
| 0.8576388888888888 | 0 |
| 0.8583333333333334 | 0 |
| 0.8590277777777778 | 0 |
| 0.8597222222222222 | 0 |
| 0.8604166666666666 | 0 |
| 0.8611111111111112 | 0 |
| 0.8618055555555556 | 0 |
| 0.8624999999999999 | 0 |
| 0.8631944444444444 | 0 |
| 0.8638888888888889 | 0 |
| 0.8645833333333334 | 0 |
| 0.8652777777777777 | 0 |
| 0.8659722222222223 | 0 |
| 0.8666666666666667 | 0 |
| 0.8673611111111111 | 0 |
| 0.8680555555555555 | 0 |
| 0.86875 | 0 |
| 0.8694444444444445 | 0 |
| 0.8701388888888889 | 0 |
| 0.8708333333333332 | 0 |
| 0.8715277777777778 | 0 |
| 0.8722222222222222 | 0 |
| 0.8729166666666667 | 0 |
| 0.873611111111111 | 0 |
| 0.8743055555555556 | 0 |
| 0.875 | 0 |
| 0.8756944444444444 | 0 |
| 0.876388888888889 | 0 |
| 0.8770833333333333 | 0 |
| 0.8777777777777778 | 0 |
| 0.8784722222222222 | 0 |
| 0.8791666666666668 | 0 |
| 0.8798611111111111 | 0 |
| 0.8805555555555555 | 0 |
| 0.88125 | 0 |
| 0.8819444444444445 | 0 |
| 0.8826388888888889 | 0 |
| 0.8833333333333333 | 0 |
| 0.8840277777777777 | 0 |
| 0.8847222222222223 | 0 |
| 0.8854166666666666 | 0 |
| 0.8861111111111111 | 0 |
| 0.8868055555555556 | 0 |
| 0.8875000000000001 | 0 |
| 0.8881944444444444 | 0 |
| 0.8888888888888888 | 0 |
| 0.8895833333333334 | 0 |
| 0.8902777777777778 | 0 |
| 0.8909722222222222 | 0 |
| 0.8916666666666666 | 0 |
| 0.8923611111111112 | 0 |
| 0.8930555555555556 | 0 |
| 0.8937499999999999 | 0 |
| 0.8944444444444444 | 0 |
| 0.8951388888888889 | 0 |
| 0.8958333333333334 | 0 |
| 0.8965277777777777 | 0 |
| 0.8972222222222223 | 0 |
| 0.8979166666666667 | 0 |
| 0.8986111111111111 | 0 |
| 0.8993055555555555 | 0 |
| 0.9 | 0 |
| 0.9006944444444445 | 0 |
| 0.9013888888888889 | 0 |
| 0.9020833333333332 | 0 |
| 0.9027777777777778 | 0 |
| 0.9034722222222222 | 0 |
| 0.9041666666666667 | 0 |
| 0.904861111111111 | 0 |
| 0.9055555555555556 | 0 |
| 0.90625 | 0 |
| 0.9069444444444444 | 0 |
| 0.907638888888889 | 0 |
| 0.9083333333333333 | 0 |
| 0.9090277777777778 | 0 |
| 0.9097222222222222 | 0 |
| 0.9104166666666668 | 0 |
| 0.9111111111111111 | 0 |
| 0.9118055555555555 | 0 |
| 0.9125 | 0 |
| 0.9131944444444445 | 0 |
| 0.9138888888888889 | 0 |
| 0.9145833333333333 | 0 |
| 0.9152777777777777 | 0 |
| 0.9159722222222223 | 0 |
| 0.9166666666666666 | 0 |
| 0.9173611111111111 | 0 |
| 0.9180555555555556 | 0 |
| 0.9187500000000001 | 0 |
| 0.9194444444444444 | 0 |
| 0.9201388888888888 | 0 |
| 0.9208333333333334 | 0 |
| 0.9215277777777778 | 0 |
| 0.9222222222222222 | 0 |
| 0.9229166666666666 | 0 |
| 0.9236111111111112 | 0 |
| 0.9243055555555556 | 0 |
| 0.9249999999999999 | 0 |
| 0.9256944444444444 | 0 |
| 0.9263888888888889 | 0 |
| 0.9270833333333334 | 0 |
| 0.9277777777777777 | 0 |
| 0.9284722222222223 | 0 |
| 0.9291666666666667 | 0 |
| 0.9298611111111111 | 0 |
| 0.9305555555555555 | 0 |
| 0.93125 | 0 |
| 0.9319444444444445 | 0 |
| 0.9326388888888889 | 0 |
| 0.9333333333333332 | 0 |
| 0.9340277777777778 | 0 |
| 0.9347222222222222 | 0 |
| 0.9354166666666667 | 0 |
| 0.936111111111111 | 0 |
| 0.9368055555555556 | 0 |
| 0.9375 | 0 |
| 0.9381944444444444 | 0 |
| 0.938888888888889 | 0 |
| 0.9395833333333333 | 0 |
| 0.9402777777777778 | 0 |
| 0.9409722222222222 | 0 |
| 0.9416666666666668 | 0 |
| 0.9423611111111111 | 0 |
| 0.9430555555555555 | 0 |
| 0.94375 | 0 |
| 0.9444444444444445 | 0 |
| 0.9451388888888889 | 0 |
| 0.9458333333333333 | 0 |
| 0.9465277777777777 | 0 |
| 0.9472222222222223 | 0 |
| 0.9479166666666666 | 0 |
| 0.9486111111111111 | 0 |
| 0.9493055555555556 | 0 |
| 0.9500000000000001 | 0 |
| 0.9506944444444444 | 0 |
| 0.9513888888888888 | 0 |
| 0.9520833333333334 | 0 |
| 0.9527777777777778 | 0 |
| 0.9534722222222222 | 0 |
| 0.9541666666666666 | 0 |
| 0.9548611111111112 | 0 |
| 0.9555555555555556 | 0 |
| 0.9562499999999999 | 0 |
| 0.9569444444444444 | 0 |
| 0.9576388888888889 | 0 |
| 0.9583333333333334 | 0 |
| 0.9590277777777777 | 0 |
| 0.9597222222222223 | 0 |
| 0.9604166666666667 | 0 |
| 0.9611111111111111 | 0 |
| 0.9618055555555555 | 0 |
| 0.9625 | 0 |
| 0.9631944444444445 | 0 |
| 0.9638888888888889 | 0 |
| 0.9645833333333332 | 0 |
| 0.9652777777777778 | 0 |
| 0.9659722222222222 | 0 |
| 0.9666666666666667 | 0 |
| 0.967361111111111 | 0 |
| 0.9680555555555556 | 0 |
| 0.96875 | 0 |
| 0.9694444444444444 | 0 |
| 0.970138888888889 | 0 |
| 0.9708333333333333 | 0 |
| 0.9715277777777778 | 0 |
| 0.9722222222222222 | 0 |
| 0.9729166666666668 | 0 |
| 0.9736111111111111 | 0 |
| 0.9743055555555555 | 0 |
| 0.975 | 0 |
| 0.9756944444444445 | 0 |
| 0.9763888888888889 | 0 |
| 0.9770833333333333 | 0 |
| 0.9777777777777777 | 0 |
| 0.9784722222222223 | 0 |
| 0.9791666666666666 | 0 |
| 0.9798611111111111 | 0 |
| 0.9805555555555556 | 0 |
| 0.9812500000000001 | 0 |
| 0.9819444444444444 | 0 |
| 0.9826388888888888 | 0 |
| 0.9833333333333334 | 0 |
| 0.9840277777777778 | 0 |
| 0.9847222222222222 | 0 |
| 0.9854166666666666 | 0 |
| 0.9861111111111112 | 0 |
| 0.9868055555555556 | 0 |
| 0.9874999999999999 | 0 |
| 0.9881944444444444 | 0 |
| 0.9888888888888889 | 0 |
| 0.9895833333333334 | 0 |
| 0.9902777777777777 | 0 |
| 0.9909722222222223 | 0 |
| 0.9916666666666667 | 0 |
| 0.9923611111111111 | 0 |
| 0.9930555555555555 | 0 |
| 0.99375 | 0 |
| 0.9944444444444445 | 0 |
| 0.9951388888888889 | 0 |
| 0.9958333333333332 | 0 |
| 0.9965277777777778 | 0 |
| 0.9972222222222222 | 0 |
| 0.9979166666666667 | 0 |
| 0.998611111111111 | 0 |
| 0.9993055555555556 | 0 |